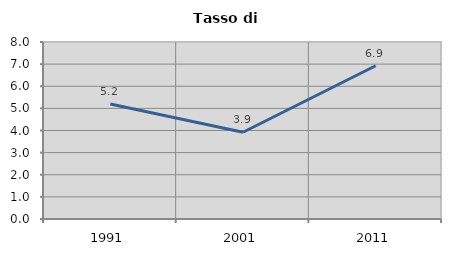
| Category | Tasso di disoccupazione   |
|---|---|
| 1991.0 | 5.198 |
| 2001.0 | 3.922 |
| 2011.0 | 6.926 |